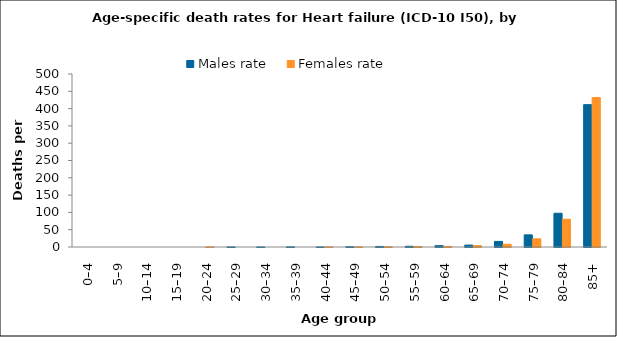
| Category | Males rate | Females rate |
|---|---|---|
| 0–4 | 0 | 0 |
| 5–9 | 0 | 0 |
| 10–14 | 0 | 0 |
| 15–19 | 0 | 0 |
| 20–24 | 0 | 0.126 |
| 25–29 | 0.108 | 0 |
| 30–34 | 0.106 | 0 |
| 35–39 | 0.319 | 0 |
| 40–44 | 0.119 | 0.116 |
| 45–49 | 0.747 | 0.244 |
| 50–54 | 1.597 | 0.595 |
| 55–59 | 2.121 | 1.153 |
| 60–64 | 3.997 | 1.695 |
| 65–69 | 5.579 | 3.996 |
| 70–74 | 16.148 | 7.916 |
| 75–79 | 35.111 | 23.559 |
| 80–84 | 97.585 | 80.279 |
| 85+ | 411.456 | 431.858 |